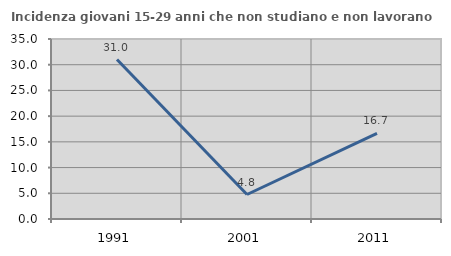
| Category | Incidenza giovani 15-29 anni che non studiano e non lavorano  |
|---|---|
| 1991.0 | 31.008 |
| 2001.0 | 4.762 |
| 2011.0 | 16.667 |